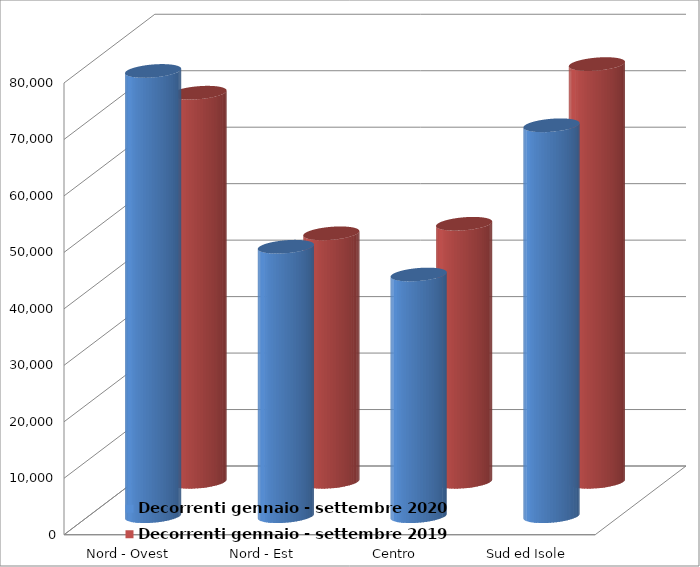
| Category | Decorrenti gennaio - settembre 2020 | Decorrenti gennaio - settembre 2019 |
|---|---|---|
| Nord - Ovest | 78843 | 68905 |
| Nord - Est | 47715 | 44007 |
| Centro | 42798 | 45694 |
| Sud ed Isole | 69225 | 73976 |